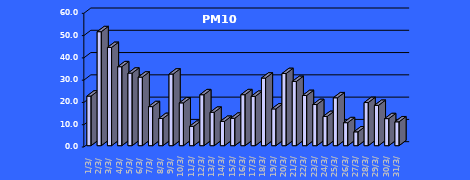
| Category | PM10 [µg/m3] |
|---|---|
| 2023-03-01 | 22.257 |
| 2023-03-02 | 51.152 |
| 2023-03-03 | 44.078 |
| 2023-03-04 | 35.434 |
| 2023-03-05 | 32.55 |
| 2023-03-06 | 30.776 |
| 2023-03-07 | 17.522 |
| 2023-03-08 | 12.201 |
| 2023-03-09 | 32.145 |
| 2023-03-10 | 19.213 |
| 2023-03-11 | 8.679 |
| 2023-03-12 | 22.864 |
| 2023-03-13 | 14.989 |
| 2023-03-14 | 10.902 |
| 2023-03-15 | 12.296 |
| 2023-03-16 | 22.882 |
| 2023-03-17 | 22.135 |
| 2023-03-18 | 30.341 |
| 2023-03-19 | 16.494 |
| 2023-03-20 | 32.372 |
| 2023-03-21 | 28.814 |
| 2023-03-22 | 22.51 |
| 2023-03-23 | 18.465 |
| 2023-03-24 | 13.103 |
| 2023-03-25 | 21.495 |
| 2023-03-26 | 10.319 |
| 2023-03-27 | 6.204 |
| 2023-03-28 | 19.354 |
| 2023-03-29 | 18.085 |
| 2023-03-30 | 12.135 |
| 2023-03-31 | 10.709 |